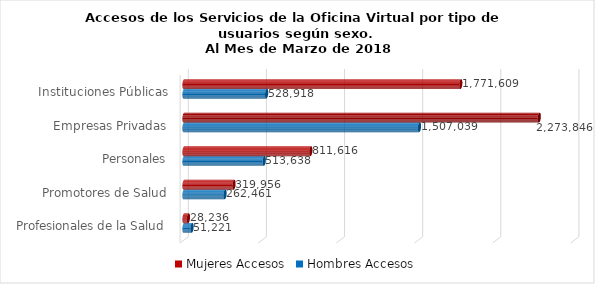
| Category | Mujeres | Hombres |
|---|---|---|
| Instituciones Públicas | 1771609 | 528918 |
| Empresas Privadas | 2273846 | 1507039 |
| Personales | 811616 | 513638 |
| Promotores de Salud | 319956 | 262461 |
| Profesionales de la Salud | 28236 | 51221 |